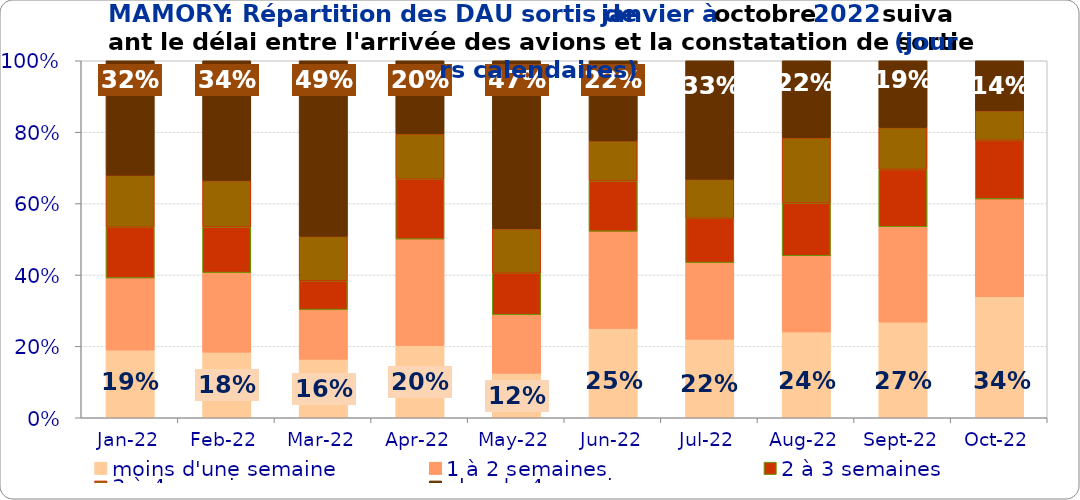
| Category | moins d'une semaine | 1 à 2 semaines | 2 à 3 semaines | 3 à 4 semaines | plus de 4 semaines |
|---|---|---|---|---|---|
| 2022-01-01 | 0.189 | 0.202 | 0.142 | 0.146 | 0.321 |
| 2022-02-01 | 0.184 | 0.223 | 0.128 | 0.13 | 0.336 |
| 2022-03-01 | 0.164 | 0.139 | 0.081 | 0.125 | 0.491 |
| 2022-04-01 | 0.202 | 0.298 | 0.168 | 0.127 | 0.205 |
| 2022-05-01 | 0.125 | 0.164 | 0.116 | 0.125 | 0.47 |
| 2022-06-01 | 0.25 | 0.272 | 0.141 | 0.112 | 0.224 |
| 2022-07-01 | 0.22 | 0.215 | 0.124 | 0.109 | 0.332 |
| 2022-08-01 | 0.24 | 0.213 | 0.148 | 0.183 | 0.216 |
| 2022-09-01 | 0.268 | 0.267 | 0.161 | 0.117 | 0.187 |
| 2022-10-01 | 0.339 | 0.274 | 0.164 | 0.083 | 0.14 |